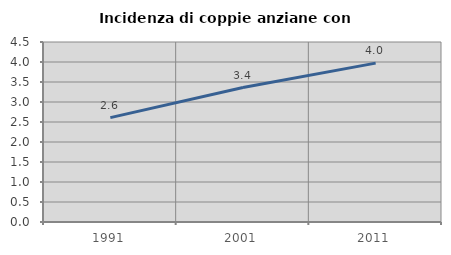
| Category | Incidenza di coppie anziane con figli |
|---|---|
| 1991.0 | 2.61 |
| 2001.0 | 3.362 |
| 2011.0 | 3.972 |